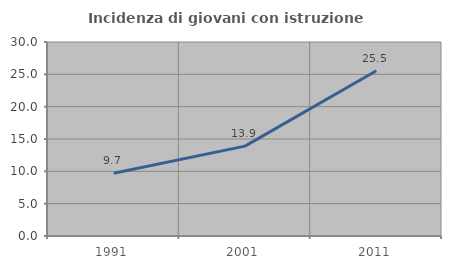
| Category | Incidenza di giovani con istruzione universitaria |
|---|---|
| 1991.0 | 9.703 |
| 2001.0 | 13.9 |
| 2011.0 | 25.546 |